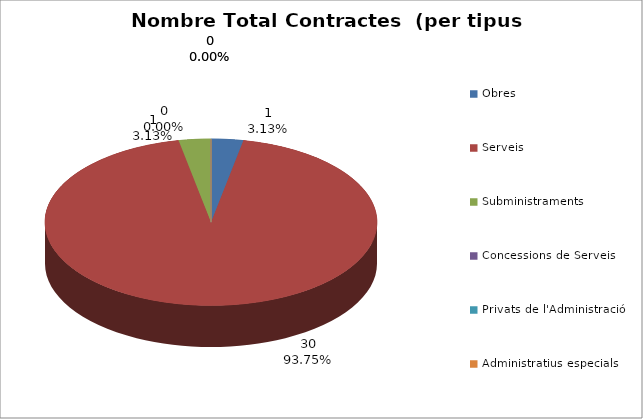
| Category | Nombre Total Contractes |
|---|---|
| Obres | 1 |
| Serveis | 30 |
| Subministraments | 1 |
| Concessions de Serveis | 0 |
| Privats de l'Administració | 0 |
| Administratius especials | 0 |